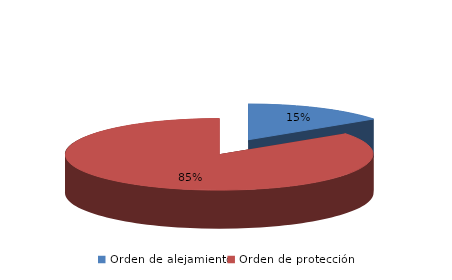
| Category | Series 0 |
|---|---|
| Orden de alejamiento | 13 |
| Orden de protección | 73 |